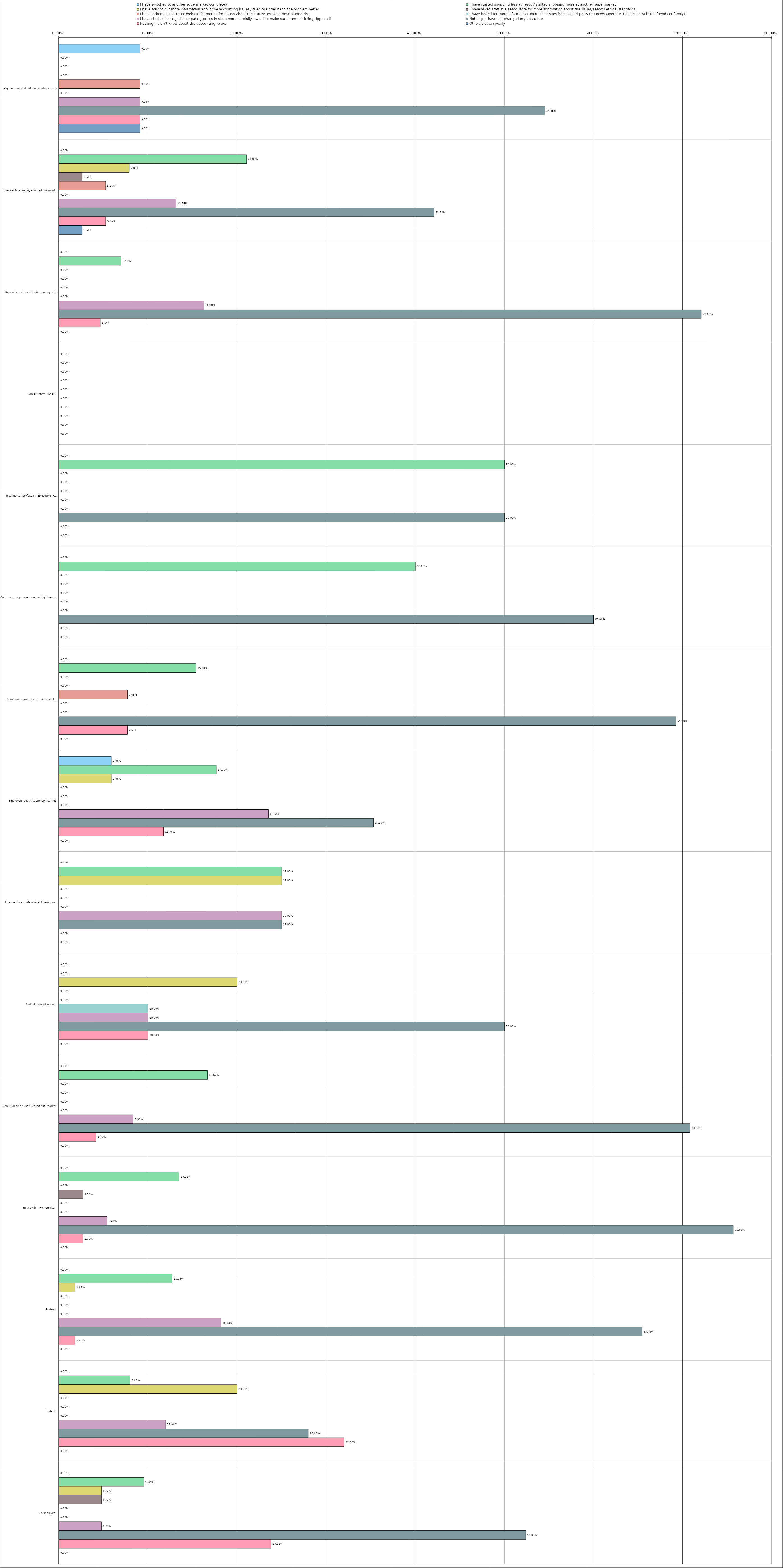
| Category | I have switched to another supermarket completely | I have started shopping less at Tesco / started shopping more at another supermarket | I have sought out more information about the accounting issues / tried to understand the problem better | I have asked staff in a Tesco store for more information about the issues/Tesco’s ethical standards | I have looked on the Tesco website for more information about the issues/Tesco’s ethical standards | I have looked for more information about the issues from a third party (eg newspaper, TV, non-Tesco website, friends or family) | I have started looking at /comparing prices in store more carefully – want to make sure I am not being ripped off | Nothing –  have not changed my behaviour | Nothing – didn’t know about the accounting issues | Other, please specify |
|---|---|---|---|---|---|---|---|---|---|---|
| 0 | 0.091 | 0 | 0 | 0 | 0.091 | 0 | 0.091 | 0.546 | 0.091 | 0.091 |
| 1 | 0 | 0.21 | 0.079 | 0.026 | 0.053 | 0 | 0.132 | 0.421 | 0.053 | 0.026 |
| 2 | 0 | 0.07 | 0 | 0 | 0 | 0 | 0.163 | 0.721 | 0.046 | 0 |
| 3 | 0 | 0 | 0 | 0 | 0 | 0 | 0 | 0 | 0 | 0 |
| 4 | 0 | 0.5 | 0 | 0 | 0 | 0 | 0 | 0.5 | 0 | 0 |
| 5 | 0 | 0.4 | 0 | 0 | 0 | 0 | 0 | 0.6 | 0 | 0 |
| 6 | 0 | 0.154 | 0 | 0 | 0.077 | 0 | 0 | 0.692 | 0.077 | 0 |
| 7 | 0.059 | 0.176 | 0.059 | 0 | 0 | 0 | 0.235 | 0.353 | 0.118 | 0 |
| 8 | 0 | 0.25 | 0.25 | 0 | 0 | 0 | 0.25 | 0.25 | 0 | 0 |
| 9 | 0 | 0 | 0.2 | 0 | 0 | 0.1 | 0.1 | 0.5 | 0.1 | 0 |
| 10 | 0 | 0.167 | 0 | 0 | 0 | 0 | 0.083 | 0.708 | 0.042 | 0 |
| 11 | 0 | 0.135 | 0 | 0.027 | 0 | 0 | 0.054 | 0.757 | 0.027 | 0 |
| 12 | 0 | 0.127 | 0.018 | 0 | 0 | 0 | 0.182 | 0.654 | 0.018 | 0 |
| 13 | 0 | 0.08 | 0.2 | 0 | 0 | 0 | 0.12 | 0.28 | 0.32 | 0 |
| 14 | 0 | 0.095 | 0.048 | 0.048 | 0 | 0 | 0.048 | 0.524 | 0.238 | 0 |